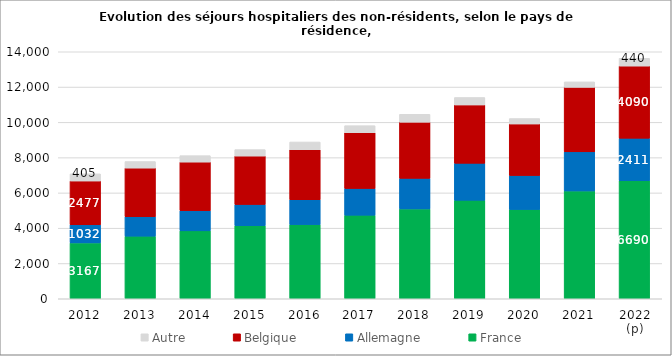
| Category | France | Allemagne | Belgique | Autre |
|---|---|---|---|---|
| 2012 | 3167 | 1032 | 2477 | 405 |
| 2013 | 3548 | 1106 | 2755 | 370 |
| 2014 | 3851 | 1141 | 2757 | 363 |
| 2015 | 4141 | 1208 | 2741 | 366 |
| 2016 | 4205 | 1409 | 2832 | 441 |
| 2017 | 4736 | 1519 | 3155 | 401 |
| 2018 | 5092 | 1731 | 3184 | 449 |
| 2019 | 5583 | 2097 | 3306 | 423 |
| 2020 | 5062 | 1925 | 2921 | 308 |
| 2021 | 6112 | 2217 | 3655 | 310 |
| 2022 (p) | 6690 | 2411 | 4090 | 440 |